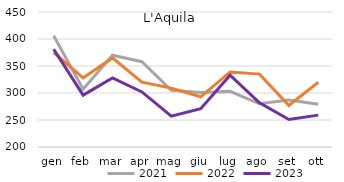
| Category | 2021 | 2022 | 2023 |
|---|---|---|---|
| gen | 406 | 375 | 381 |
| feb | 307 | 328 | 296 |
| mar | 370 | 365 | 328 |
| apr | 358 | 320 | 302 |
| mag | 305 | 309 | 257 |
| giu | 301 | 293 | 271 |
| lug | 303 | 339 | 333 |
| ago | 280 | 335 | 282 |
| set | 287 | 277 | 251 |
| ott | 279 | 320 | 259 |